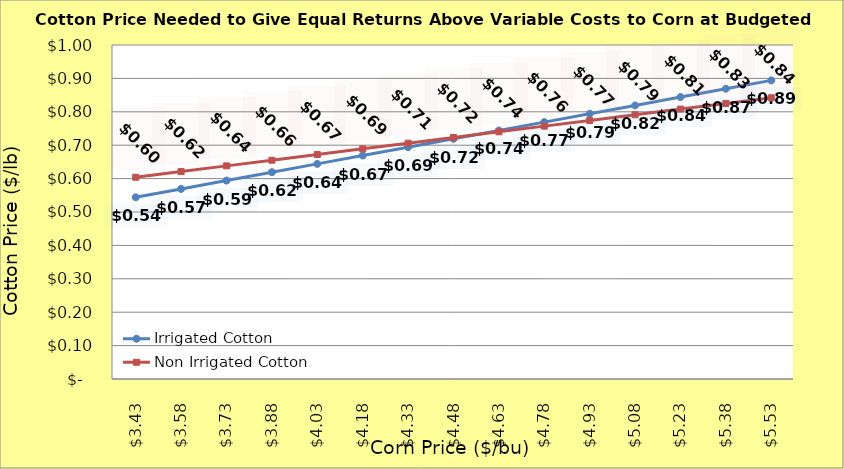
| Category | Irrigated Cotton | Non Irrigated Cotton |
|---|---|---|
| 3.4299999999999997 | 0.544 | 0.604 |
| 3.5799999999999996 | 0.569 | 0.621 |
| 3.7299999999999995 | 0.594 | 0.638 |
| 3.8799999999999994 | 0.619 | 0.655 |
| 4.029999999999999 | 0.644 | 0.672 |
| 4.18 | 0.669 | 0.689 |
| 4.33 | 0.694 | 0.706 |
| 4.48 | 0.719 | 0.723 |
| 4.630000000000001 | 0.744 | 0.74 |
| 4.780000000000001 | 0.769 | 0.757 |
| 4.9300000000000015 | 0.794 | 0.774 |
| 5.080000000000002 | 0.819 | 0.791 |
| 5.230000000000002 | 0.844 | 0.808 |
| 5.380000000000003 | 0.869 | 0.825 |
| 5.530000000000003 | 0.894 | 0.842 |